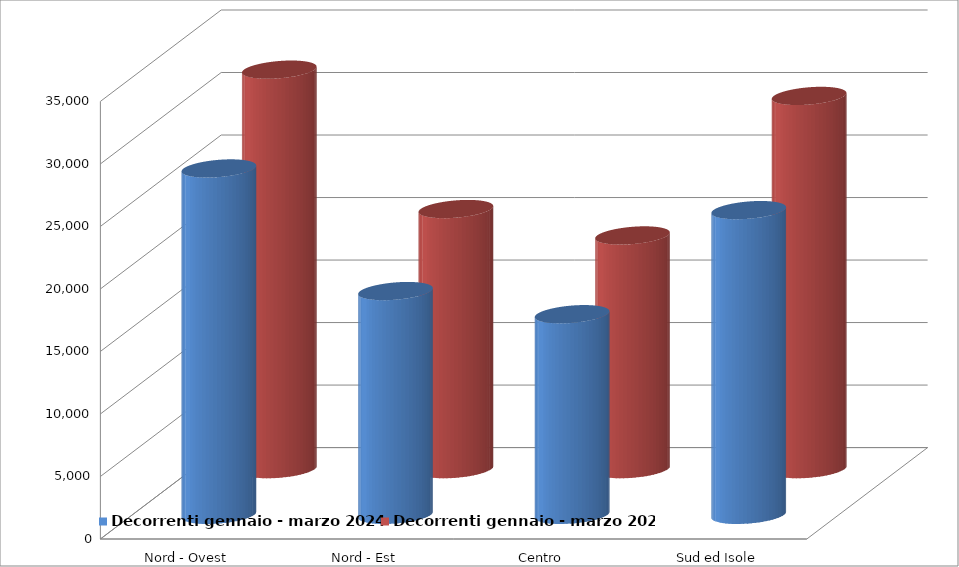
| Category | Decorrenti gennaio - marzo 2024 | Decorrenti gennaio - marzo 2023 |
|---|---|---|
| Nord - Ovest | 27706 | 31954 |
| Nord - Est | 17900 | 20805 |
| Centro | 16050 | 18693 |
| Sud ed Isole | 24375 | 29853 |